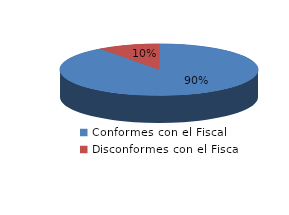
| Category | Series 0 |
|---|---|
| 0 | 304 |
| 1 | 34 |